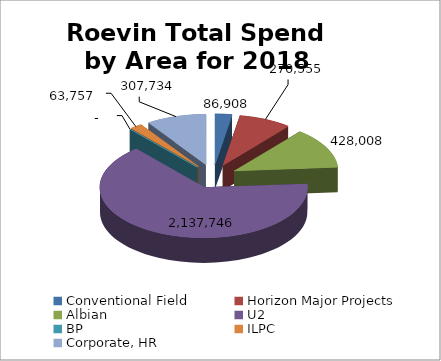
| Category | 2018 |
|---|---|
| Conventional Field | 86907.64 |
| Horizon Major Projects | 270555.2 |
| Albian  | 428008 |
| U2 | 2137746.29 |
| BP | 0 |
| ILPC | 63756.57 |
| Corporate, HR | 307733.92 |